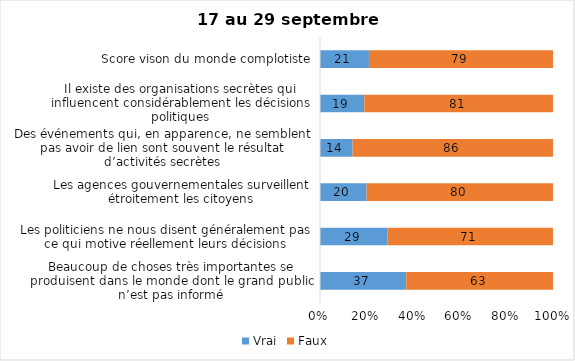
| Category | Vrai | Faux |
|---|---|---|
| Beaucoup de choses très importantes se produisent dans le monde dont le grand public n’est pas informé | 37 | 63 |
| Les politiciens ne nous disent généralement pas ce qui motive réellement leurs décisions | 29 | 71 |
| Les agences gouvernementales surveillent étroitement les citoyens | 20 | 80 |
| Des événements qui, en apparence, ne semblent pas avoir de lien sont souvent le résultat d’activités secrètes | 14 | 86 |
| Il existe des organisations secrètes qui influencent considérablement les décisions politiques | 19 | 81 |
| Score vison du monde complotiste | 21 | 79 |